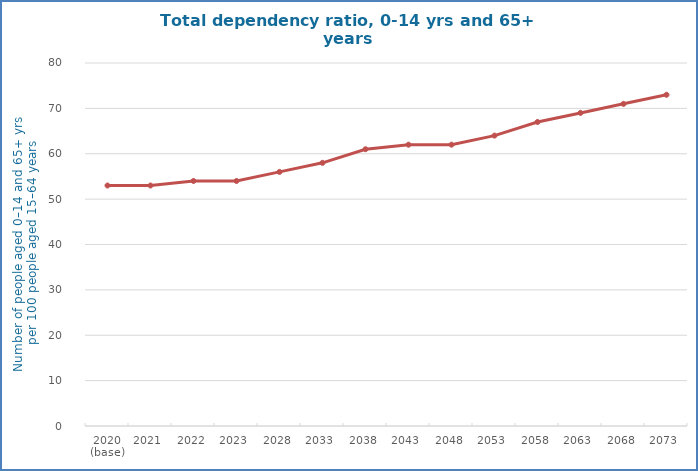
| Category | Series 1 |
|---|---|
| 2020 (base) | 53 |
| 2021 | 53 |
| 2022 | 54 |
| 2023 | 54 |
| 2028 | 56 |
| 2033 | 58 |
| 2038 | 61 |
| 2043 | 62 |
| 2048 | 62 |
| 2053 | 64 |
| 2058 | 67 |
| 2063 | 69 |
| 2068 | 71 |
| 2073 | 73 |